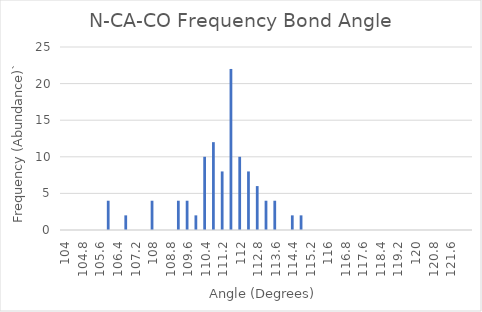
| Category | Series 0 |
|---|---|
| 104.0 | 0 |
| 104.4 | 0 |
| 104.80000000000001 | 0 |
| 105.20000000000002 | 0 |
| 105.60000000000002 | 0 |
| 106.00000000000003 | 4 |
| 106.40000000000003 | 0 |
| 106.80000000000004 | 2 |
| 107.20000000000005 | 0 |
| 107.60000000000005 | 0 |
| 108.00000000000006 | 4 |
| 108.40000000000006 | 0 |
| 108.80000000000007 | 0 |
| 109.20000000000007 | 4 |
| 109.60000000000008 | 4 |
| 110.00000000000009 | 2 |
| 110.40000000000009 | 10 |
| 110.8000000000001 | 12 |
| 111.2000000000001 | 8 |
| 111.60000000000011 | 22 |
| 112.00000000000011 | 10 |
| 112.40000000000012 | 8 |
| 112.80000000000013 | 6 |
| 113.20000000000013 | 4 |
| 113.60000000000014 | 4 |
| 114.00000000000014 | 0 |
| 114.40000000000015 | 2 |
| 114.80000000000015 | 2 |
| 115.20000000000016 | 0 |
| 115.60000000000016 | 0 |
| 116.00000000000017 | 0 |
| 116.40000000000018 | 0 |
| 116.80000000000018 | 0 |
| 117.20000000000019 | 0 |
| 117.6000000000002 | 0 |
| 118.0000000000002 | 0 |
| 118.4000000000002 | 0 |
| 118.80000000000021 | 0 |
| 119.20000000000022 | 0 |
| 119.60000000000022 | 0 |
| 120.00000000000023 | 0 |
| 120.40000000000023 | 0 |
| 120.80000000000024 | 0 |
| 121.20000000000024 | 0 |
| 121.60000000000025 | 0 |
| 122.00000000000026 | 0 |